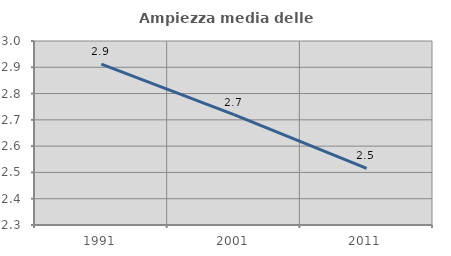
| Category | Ampiezza media delle famiglie |
|---|---|
| 1991.0 | 2.912 |
| 2001.0 | 2.72 |
| 2011.0 | 2.516 |